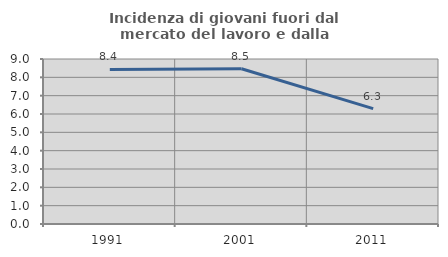
| Category | Incidenza di giovani fuori dal mercato del lavoro e dalla formazione  |
|---|---|
| 1991.0 | 8.432 |
| 2001.0 | 8.469 |
| 2011.0 | 6.296 |